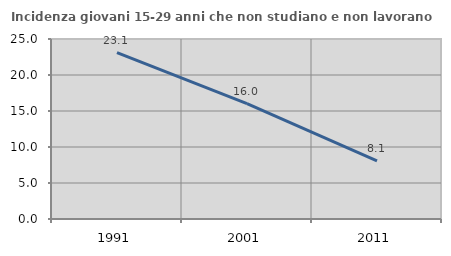
| Category | Incidenza giovani 15-29 anni che non studiano e non lavorano  |
|---|---|
| 1991.0 | 23.121 |
| 2001.0 | 16.018 |
| 2011.0 | 8.065 |